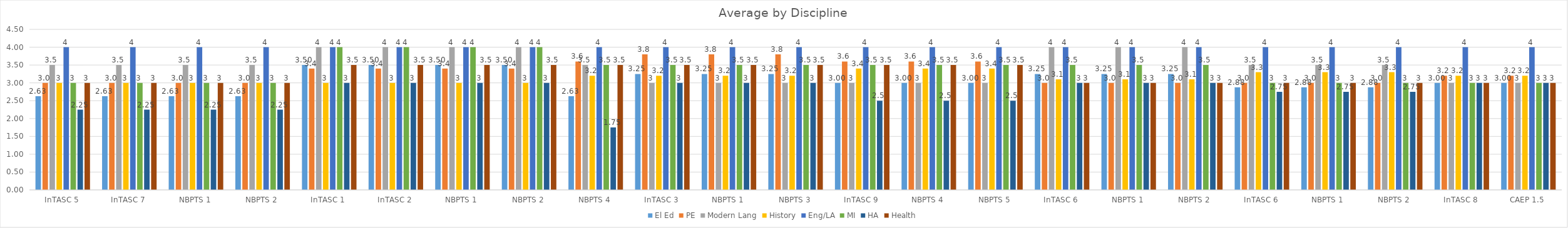
| Category | El Ed | PE | Modern Lang | History | Eng/LA | MI | HA | Health |
|---|---|---|---|---|---|---|---|---|
| InTASC 5 | 2.625 | 3 | 3.5 | 3 | 4 | 3 | 2.25 | 3 |
| InTASC 7 | 2.625 | 3 | 3.5 | 3 | 4 | 3 | 2.25 | 3 |
| NBPTS 1 | 2.625 | 3 | 3.5 | 3 | 4 | 3 | 2.25 | 3 |
| NBPTS 2 | 2.625 | 3 | 3.5 | 3 | 4 | 3 | 2.25 | 3 |
| InTASC 1 | 3.5 | 3.4 | 4 | 3 | 4 | 4 | 3 | 3.5 |
| InTASC 2 | 3.5 | 3.4 | 4 | 3 | 4 | 4 | 3 | 3.5 |
| NBPTS 1 | 3.5 | 3.4 | 4 | 3 | 4 | 4 | 3 | 3.5 |
| NBPTS 2 | 3.5 | 3.4 | 4 | 3 | 4 | 4 | 3 | 3.5 |
| NBPTS 4 | 2.625 | 3.6 | 3.5 | 3.2 | 4 | 3.5 | 1.75 | 3.5 |
| InTASC 3 | 3.25 | 3.8 | 3 | 3.2 | 4 | 3.5 | 3 | 3.5 |
| NBPTS 1 | 3.25 | 3.8 | 3 | 3.2 | 4 | 3.5 | 3 | 3.5 |
| NBPTS 3 | 3.25 | 3.8 | 3 | 3.2 | 4 | 3.5 | 3 | 3.5 |
| InTASC 9 | 3 | 3.6 | 3 | 3.4 | 4 | 3.5 | 2.5 | 3.5 |
| NBPTS 4 | 3 | 3.6 | 3 | 3.4 | 4 | 3.5 | 2.5 | 3.5 |
| NBPTS 5 | 3 | 3.6 | 3 | 3.4 | 4 | 3.5 | 2.5 | 3.5 |
| InTASC 6 | 3.25 | 3 | 4 | 3.1 | 4 | 3.5 | 3 | 3 |
| NBPTS 1 | 3.25 | 3 | 4 | 3.1 | 4 | 3.5 | 3 | 3 |
| NBPTS 2 | 3.25 | 3 | 4 | 3.1 | 4 | 3.5 | 3 | 3 |
| InTASC 6 | 2.875 | 3 | 3.5 | 3.3 | 4 | 3 | 2.75 | 3 |
| NBPTS 1 | 2.875 | 3 | 3.5 | 3.3 | 4 | 3 | 2.75 | 3 |
| NBPTS 2 | 2.875 | 3 | 3.5 | 3.3 | 4 | 3 | 2.75 | 3 |
| InTASC 8 | 3 | 3.2 | 3 | 3.2 | 4 | 3 | 3 | 3 |
| CAEP 1.5 | 3 | 3.2 | 3 | 3.2 | 4 | 3 | 3 | 3 |